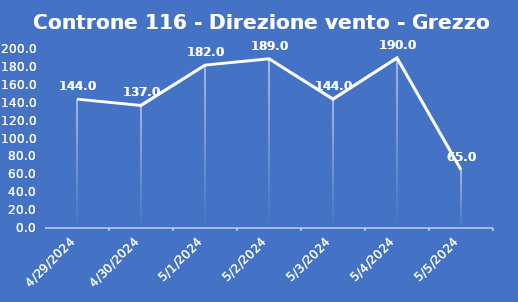
| Category | Controne 116 - Direzione vento - Grezzo (°N) |
|---|---|
| 4/29/24 | 144 |
| 4/30/24 | 137 |
| 5/1/24 | 182 |
| 5/2/24 | 189 |
| 5/3/24 | 144 |
| 5/4/24 | 190 |
| 5/5/24 | 65 |